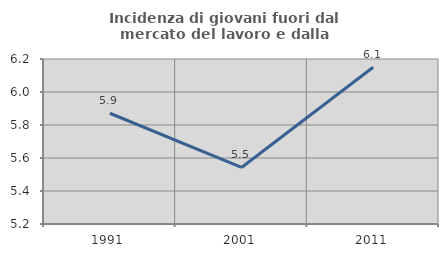
| Category | Incidenza di giovani fuori dal mercato del lavoro e dalla formazione  |
|---|---|
| 1991.0 | 5.871 |
| 2001.0 | 5.543 |
| 2011.0 | 6.15 |